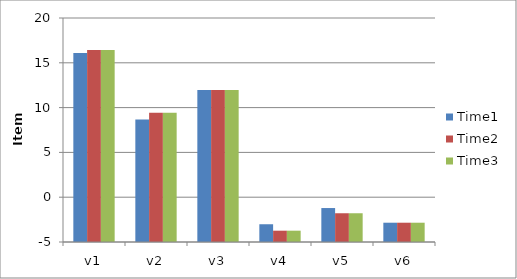
| Category | Time1 | Time2 | Time3 |
|---|---|---|---|
| v1 | 16.099 | 16.428 | 16.428 |
| v2 | 8.681 | 9.423 | 9.423 |
| v3 | 11.956 | 11.956 | 11.956 |
| v4 | -3.018 | -3.737 | -3.737 |
| v5 | -1.21 | -1.791 | -1.791 |
| v6 | -2.847 | -2.847 | -2.847 |